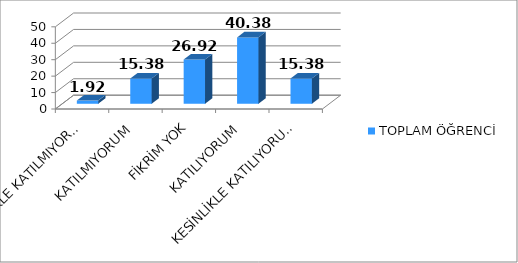
| Category | TOPLAM ÖĞRENCİ |
|---|---|
| KESİNLİKLE KATILMIYORUM | 1.92 |
| KATILMIYORUM | 15.38 |
| FİKRİM YOK | 26.92 |
| KATILIYORUM | 40.38 |
| KESİNLİKLE KATILIYORUM | 15.38 |